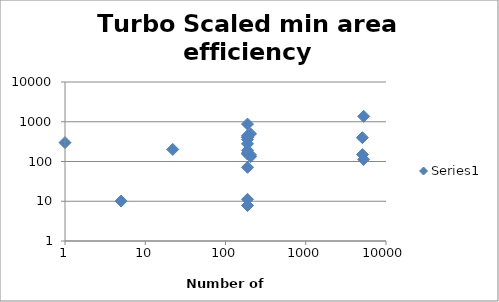
| Category | Series 0 |
|---|---|
| 5263.0 | 1369.697 |
| 5075.0 | 397.99 |
| 5263.0 | 112.79 |
| 205.0 | 496.911 |
| 188.0 | 406.827 |
| 188.0 | 875.294 |
| 188.0 | 359.499 |
| 205.0 | 146.156 |
| 188.0 | 7.812 |
| 5092.0 | 149.375 |
| 205.0 | 132 |
| 188.0 | 190.965 |
| 188.0 | 444.482 |
| 22.0 | 200.917 |
| 188.0 | 279.221 |
| 188.0 | 154.217 |
| 188.0 | 406.827 |
| 188.0 | 71.429 |
| 188.0 | 163.636 |
| 188.0 | 11.194 |
| 5.0 | 10.093 |
| 1.0 | 298.459 |